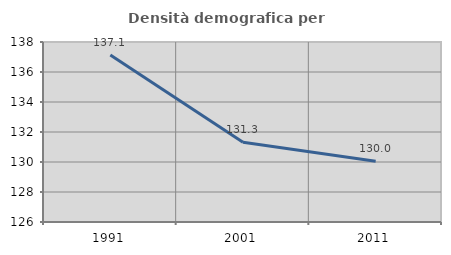
| Category | Densità demografica |
|---|---|
| 1991.0 | 137.128 |
| 2001.0 | 131.318 |
| 2011.0 | 130.05 |